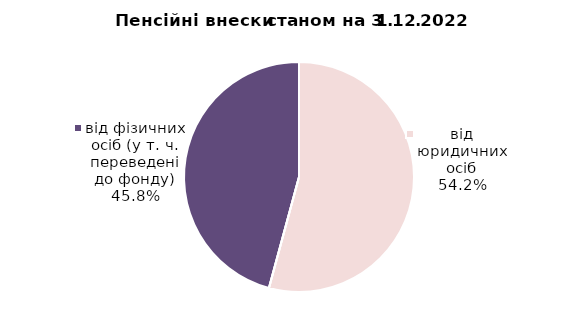
| Category | Series 0 |
|---|---|
| від юридичних осіб | 924.798 |
| від ФОПів | 0.312 |
| від фізичних осіб (у т. ч. переведені до фонду) | 781.21 |